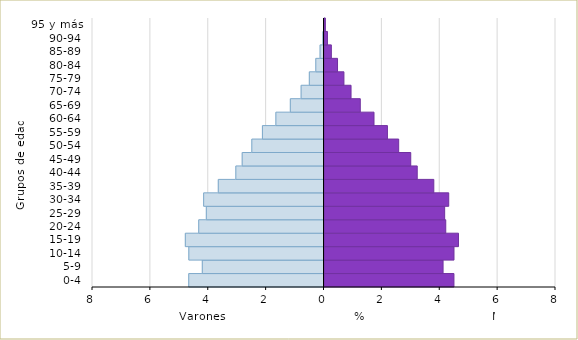
| Category | Varón  | Mujer |
|---|---|---|
| 0-4 | -4.674 | 4.474 |
| 5-9 | -4.205 | 4.097 |
| 10-14 | -4.671 | 4.475 |
| 15-19 | -4.792 | 4.63 |
| 20-24 | -4.329 | 4.19 |
| 25-29 | -4.066 | 4.153 |
| 30-34 | -4.159 | 4.293 |
| 35-39 | -3.653 | 3.777 |
| 40-44 | -3.047 | 3.204 |
| 45-49 | -2.827 | 2.98 |
| 50-54 | -2.494 | 2.564 |
| 55-59 | -2.128 | 2.174 |
| 60-64 | -1.663 | 1.711 |
| 65-69 | -1.163 | 1.237 |
| 70-74 | -0.791 | 0.917 |
| 75-79 | -0.507 | 0.672 |
| 80-84 | -0.283 | 0.45 |
| 85-89 | -0.136 | 0.237 |
| 90-94 | -0.037 | 0.102 |
| 95 y más | -0.008 | 0.03 |